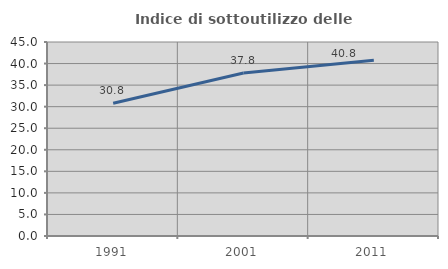
| Category | Indice di sottoutilizzo delle abitazioni  |
|---|---|
| 1991.0 | 30.798 |
| 2001.0 | 37.802 |
| 2011.0 | 40.751 |